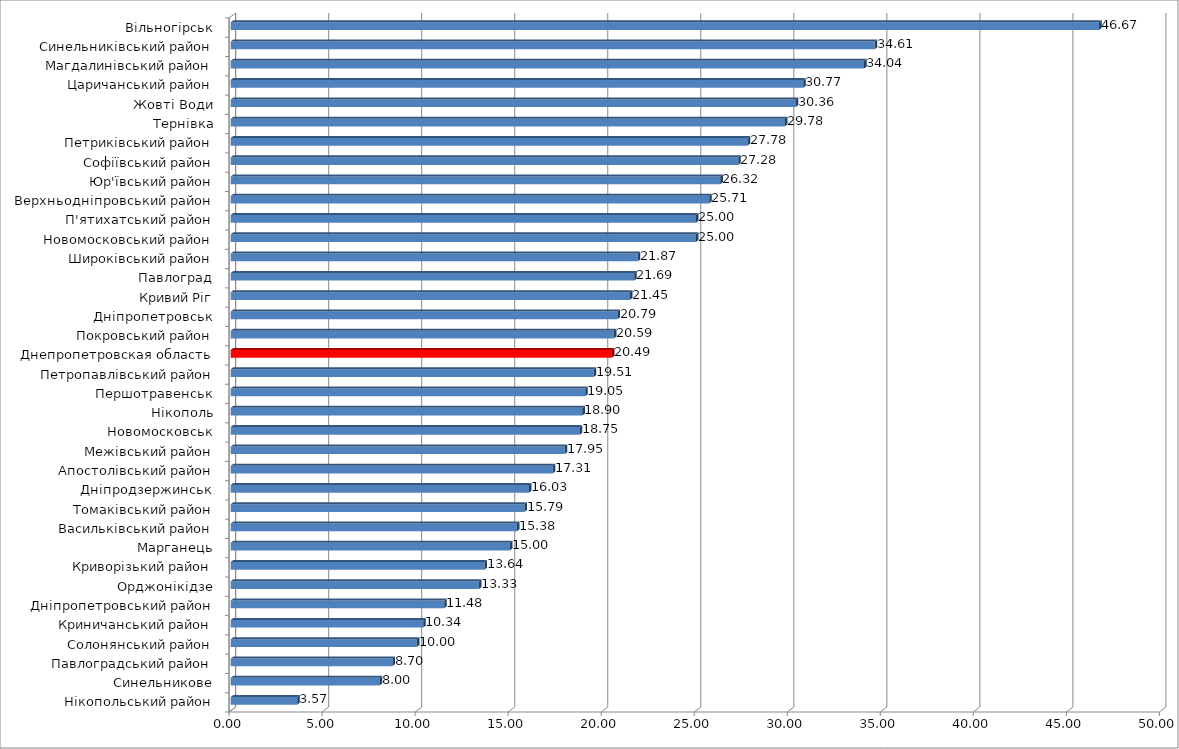
| Category | Series 0 |
|---|---|
| Нікопольський район | 3.571 |
| Синельникове | 8.001 |
| Павлоградський район | 8.696 |
| Солонянський район | 10.001 |
| Криничанський район | 10.344 |
| Дніпропетровський район | 11.476 |
| Орджонікідзе | 13.333 |
| Криворізький район | 13.635 |
| Марганець | 14.999 |
| Васильківський район | 15.385 |
| Томаківський район | 15.789 |
| Дніпродзержинськ | 16.033 |
| Апостолівський район | 17.308 |
| Межівський район | 17.948 |
| Новомосковськ | 18.751 |
| Нікополь | 18.898 |
| Першотравенськ | 19.05 |
| Петропавлівський район | 19.512 |
| Днепропетровская область | 20.486 |
| Покровський район | 20.588 |
| Дніпропетровськ | 20.788 |
| Кривий Ріг | 21.45 |
| Павлоград | 21.687 |
| Широківський район | 21.874 |
| Новомосковський район | 25 |
| П'ятихатський район | 25.001 |
| Верхньодніпровський район | 25.715 |
| Юр'ївський район | 26.316 |
| Софіївський район | 27.276 |
| Петриківський район | 27.777 |
| Тернівка | 29.785 |
| Жовті Води | 30.357 |
| Царичанський район | 30.769 |
| Магдалинівський район | 34.04 |
| Синельниківський район | 34.612 |
| Вільногірськ | 46.668 |